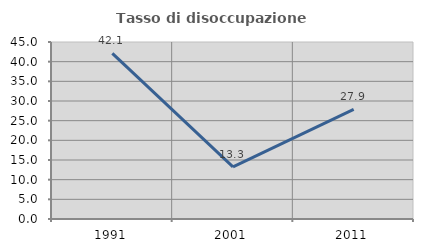
| Category | Tasso di disoccupazione giovanile  |
|---|---|
| 1991.0 | 42.105 |
| 2001.0 | 13.265 |
| 2011.0 | 27.869 |